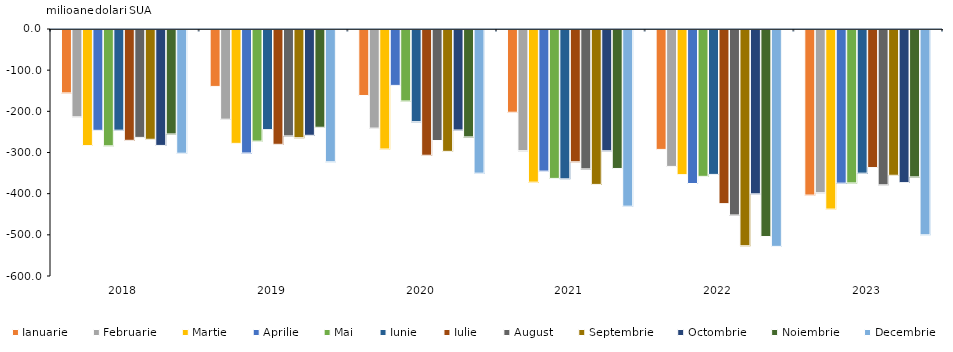
| Category | Ianuarie | Februarie | Martie | Aprilie | Mai | Iunie | Iulie | August | Septembrie | Octombrie | Noiembrie | Decembrie |
|---|---|---|---|---|---|---|---|---|---|---|---|---|
| 2018.0 | -154 | -212.1 | -282 | -244.9 | -282.6 | -244.6 | -269.2 | -262.1 | -266.7 | -281.6 | -253.7 | -300.5 |
| 2019.0 | -138.3 | -217.9 | -276.6 | -300 | -271.1 | -243.2 | -278.9 | -258.5 | -262.9 | -257 | -237.5 | -321.4 |
| 2020.0 | -160.3 | -239.5 | -290.3 | -135.8 | -173.7 | -223.9 | -305.5 | -269.7 | -296 | -244.2 | -260.9 | -349 |
| 2021.0 | -201 | -294.4 | -370.8 | -344 | -361.7 | -362.8 | -321.3 | -338.6 | -376.3 | -294.6 | -337.6 | -429.2 |
| 2022.0 | -291.3 | -332.6 | -352.5 | -374.1 | -356.7 | -352 | -422.9 | -450.6 | -525.3 | -399.2 | -502.9 | -526.8 |
| 2023.0 | -402.2 | -396.5 | -436.2 | -373.2 | -372.7 | -349 | -335.3 | -377.3 | -354.1 | -371.9 | -358 | -498.7 |